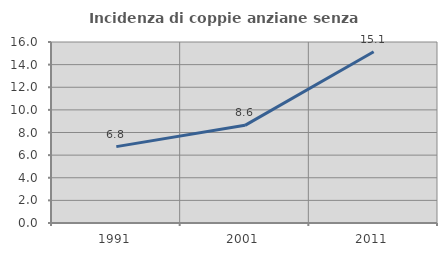
| Category | Incidenza di coppie anziane senza figli  |
|---|---|
| 1991.0 | 6.751 |
| 2001.0 | 8.633 |
| 2011.0 | 15.142 |